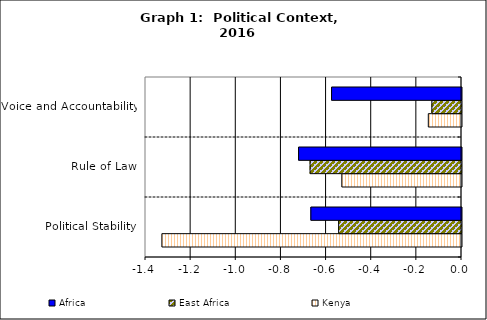
| Category | Kenya | East Africa | Africa |
|---|---|---|---|
| Political Stability | -1.327 | -0.544 | -0.667 |
| Rule of Law | -0.53 | -0.671 | -0.722 |
| Voice and Accountability | -0.147 | -0.131 | -0.576 |